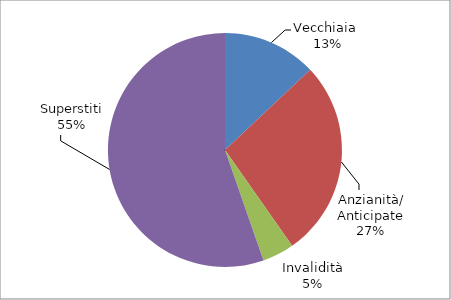
| Category | Series 0 |
|---|---|
| Vecchiaia  | 4120 |
| Anzianità/ Anticipate | 8665 |
| Invalidità | 1393 |
| Superstiti | 17565 |